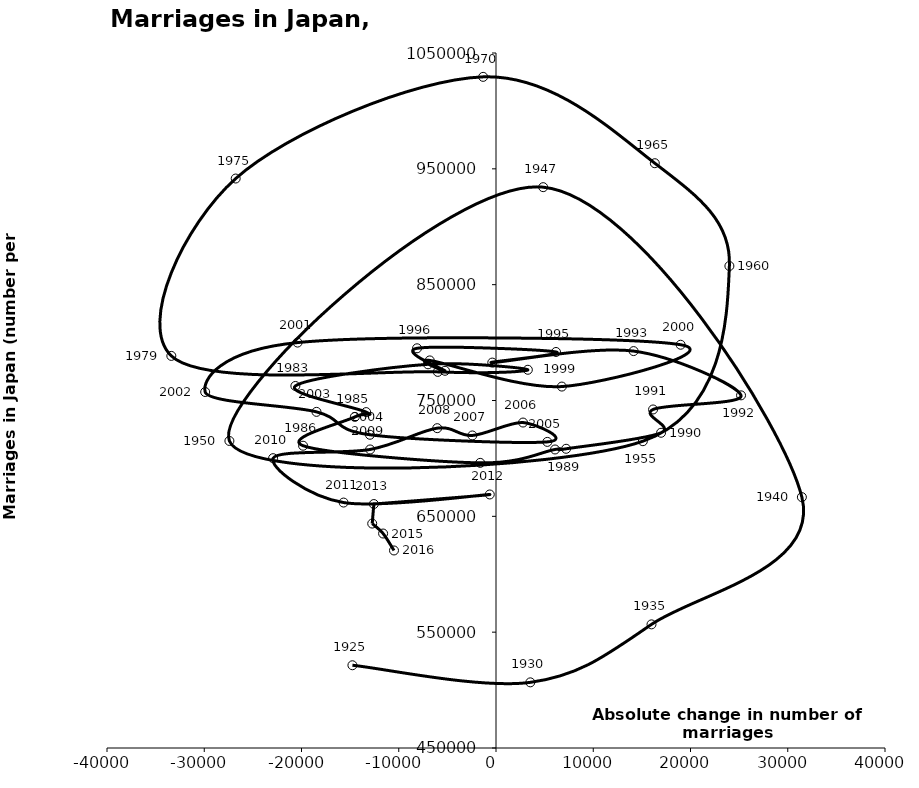
| Category | Series 0 |
|---|---|
| -14764.0 | 521438 |
| 3529.2 | 506674 |
| 15990.1 | 556730 |
| 31453.333333333332 | 666575 |
| 4850.6 | 934170 |
| -27413.625 | 715081 |
| 15103.4 | 714861 |
| 23999.1 | 866115 |
| 16329.0 | 954852 |
| -1322.4 | 1029405 |
| -26766.666666666668 | 941628 |
| -33385.2 | 788505 |
| -5987.0 | 774702 |
| 3275.0 | 776531 |
| -6989.5 | 781252 |
| -20630.5 | 762552 |
| -13351.0 | 739991 |
| -14514.5 | 735850 |
| -19838.5 | 710962 |
| -1623.0 | 696173 |
| 6071.5 | 707716 |
| 7211.0 | 708316 |
| 16974.0 | 722138 |
| 16151.5 | 742264 |
| 25197.0 | 754441 |
| 14148.5 | 792658 |
| -385.0 | 782738 |
| 6171.0 | 791888 |
| -8118.5 | 795080 |
| -5242.5 | 775651 |
| -6811.5 | 784595 |
| 6771.5 | 762028 |
| 18985.5 | 798138 |
| -20403.5 | 799999 |
| -29904.0 | 757331 |
| -18457.0 | 740191 |
| -12963.0 | 720417 |
| 5277.0 | 714265 |
| 2778.5 | 730971 |
| -2432.5 | 719822 |
| -6044.0 | 726106 |
| -12946.0 | 707734 |
| -22919.5 | 700214 |
| -15672.5 | 661895 |
| -641.0 | 668869 |
| -12560.0 | 660613 |
| -12728.5 | 643749 |
| -11609.0 | 635156 |
| -10489.5 | 620531 |